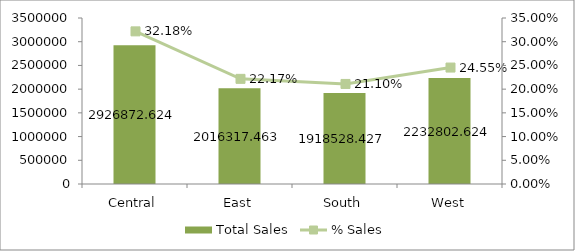
| Category | Total Sales |
|---|---|
| Central | 2926872.624 |
| East | 2016317.463 |
| South | 1918528.427 |
| West | 2232802.624 |